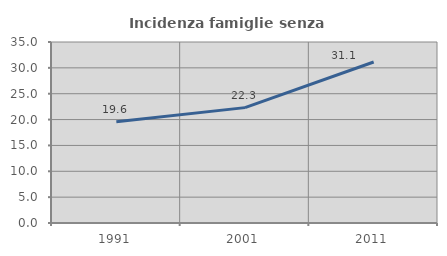
| Category | Incidenza famiglie senza nuclei |
|---|---|
| 1991.0 | 19.565 |
| 2001.0 | 22.312 |
| 2011.0 | 31.132 |